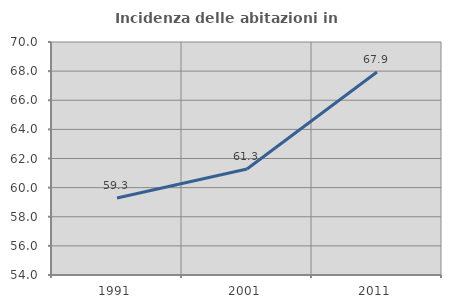
| Category | Incidenza delle abitazioni in proprietà  |
|---|---|
| 1991.0 | 59.288 |
| 2001.0 | 61.275 |
| 2011.0 | 67.935 |